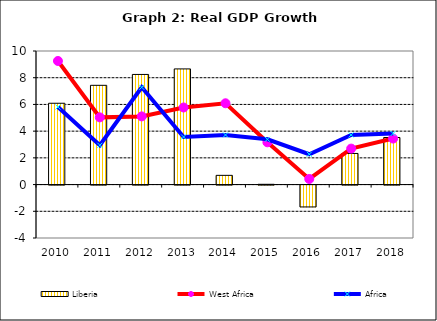
| Category | Liberia |
|---|---|
| 2010.0 | 6.088 |
| 2011.0 | 7.431 |
| 2012.0 | 8.245 |
| 2013.0 | 8.659 |
| 2014.0 | 0.691 |
| 2015.0 | 0.02 |
| 2016.0 | -1.637 |
| 2017.0 | 2.329 |
| 2018.0 | 3.524 |